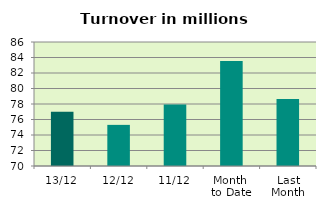
| Category | Series 0 |
|---|---|
| 13/12 | 77.014 |
| 12/12 | 75.306 |
| 11/12 | 77.934 |
| Month 
to Date | 83.56 |
| Last
Month | 78.658 |